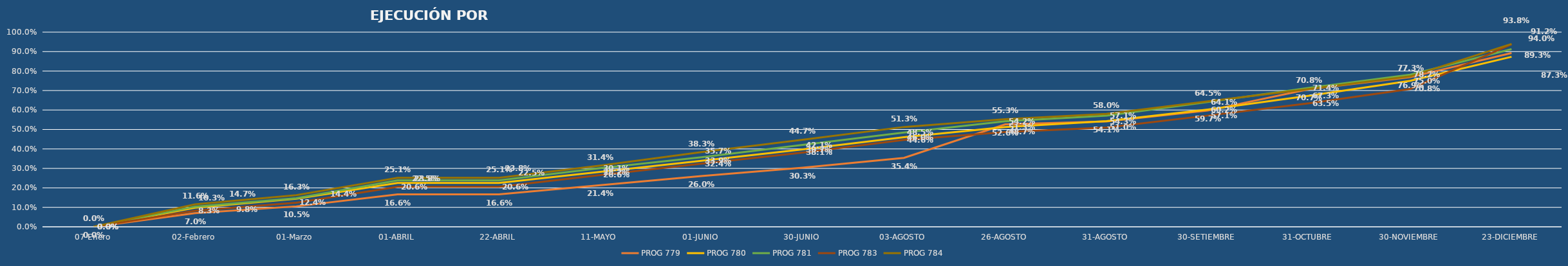
| Category | PROG 779 | PROG 780 | PROG 781 | PROG 783 | PROG 784 |
|---|---|---|---|---|---|
| 07-Enero | 0 | 0 | 0 | 0 | 0 |
| 02-Febrero | 0.07 | 0.098 | 0.103 | 0.083 | 0.116 |
| 01-Marzo | 0.105 | 0.144 | 0.147 | 0.124 | 0.163 |
| 01-ABRIL | 0.166 | 0.225 | 0.238 | 0.206 | 0.251 |
| 22-ABRIL | 0.166 | 0.225 | 0.238 | 0.206 | 0.251 |
| 11-MAYO | 0.214 | 0.282 | 0.301 | 0.266 | 0.314 |
| 01-JUNIO | 0.26 | 0.339 | 0.357 | 0.324 | 0.383 |
| 30-JUNIO | 0.303 | 0.397 | 0.421 | 0.381 | 0.447 |
| 03-AGOSTO | 0.354 | 0.46 | 0.485 | 0.446 | 0.513 |
| 26-AGOSTO | 0.526 | 0.513 | 0.542 | 0.487 | 0.553 |
| 31-AGOSTO | 0.541 | 0.543 | 0.571 | 0.51 | 0.58 |
| 30-SETIEMBRE | 0.597 | 0.602 | 0.641 | 0.571 | 0.645 |
| 31-OCTUBRE | 0.707 | 0.673 | 0.714 | 0.635 | 0.708 |
| 30-NOVIEMBRE | 0.769 | 0.75 | 0.782 | 0.708 | 0.773 |
| 23-DICIEMBRE | 0.893 | 0.873 | 0.912 | 0.938 | 0.94 |